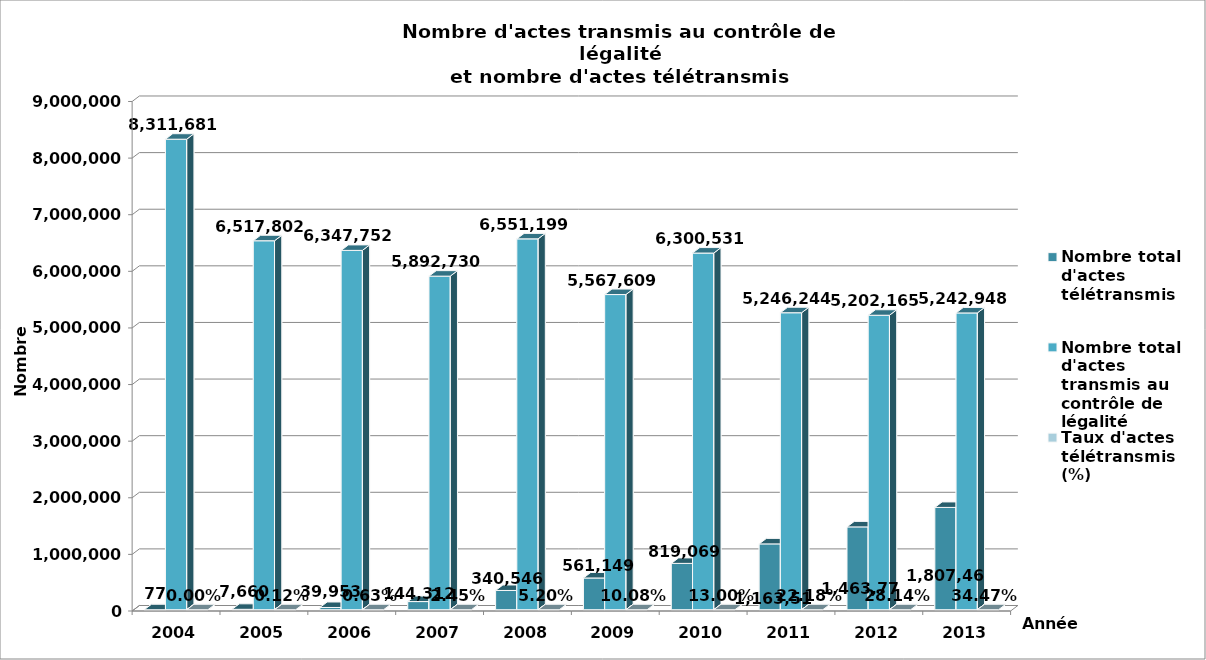
| Category | Nombre total d'actes télétransmis | Nombre total d'actes transmis au contrôle de légalité | Taux d'actes télétransmis (%) |
|---|---|---|---|
| 2004.0 | 77 | 8311681 | 0 |
| 2005.0 | 7660 | 6517802 | 0.001 |
| 2006.0 | 39953 | 6347752 | 0.006 |
| 2007.0 | 144312 | 5892730 | 0.024 |
| 2008.0 | 340546 | 6551199 | 0.052 |
| 2009.0 | 561149 | 5567609 | 0.101 |
| 2010.0 | 819069 | 6300530.769 | 0.13 |
| 2011.0 | 1163519 | 5246244 | 0.222 |
| 2012.0 | 1463770 | 5202165 | 0.281 |
| 2013.0 | 1807469 | 5242948 | 0.345 |